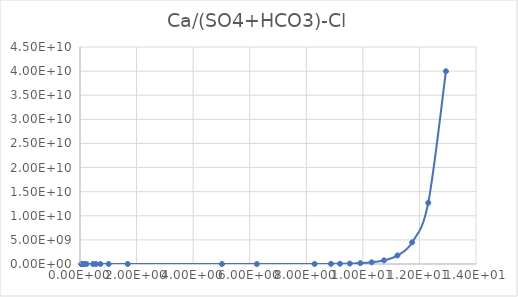
| Category | Series 0 |
|---|---|
| 0.045799 | 3.537 |
| 0.050887 | 3.567 |
| 0.057259 | 3.603 |
| 0.065457 | 3.646 |
| 0.076371 | 3.701 |
| 0.091686 | 3.774 |
| 0.11463 | 3.879 |
| 0.15299 | 4.05 |
| 0.22971 | 4.402 |
| 0.46165 | 5.742 |
| 0.56409 | 6.525 |
| 0.72494 | 8.066 |
| 1.0141 | 12.288 |
| 1.6871 | 38.497 |
| 5.0184 | 23439.958 |
| 6.2531 | 245967.377 |
| 8.2936 | 10624069.653 |
| 8.8726 | 29383928.541 |
| 9.1936 | 51174228.693 |
| 9.5386 | 92575645.893 |
| 9.9106 | 175452396.357 |
| 10.313 | 352103600.462 |
| 10.749 | 757060555.931 |
| 11.223 | 1763822253.843 |
| 11.742 | 4498481991.894 |
| 12.311 | 12683292799.274 |
| 12.937 | 39980121750.557 |